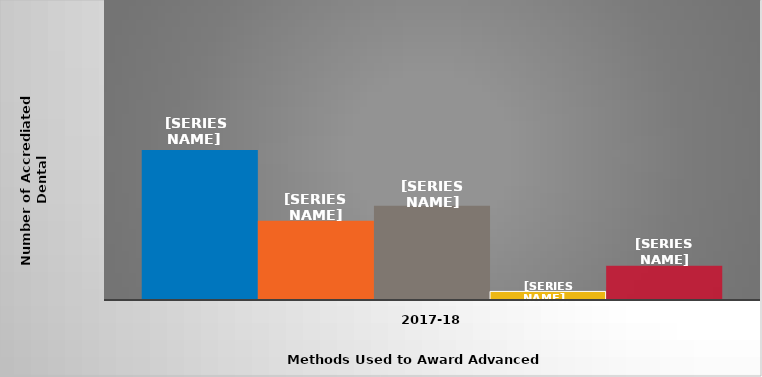
| Category | Transfer of credit | Equivalency examinations | Challenge examinations | Completion of non-accredited dental assisting program at institution | Other |
|---|---|---|---|---|---|
| 2017-18 | 70 | 37 | 44 | 4 | 16 |